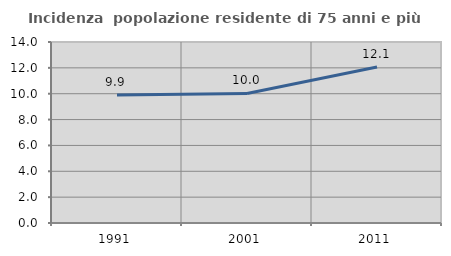
| Category | Incidenza  popolazione residente di 75 anni e più |
|---|---|
| 1991.0 | 9.906 |
| 2001.0 | 10.021 |
| 2011.0 | 12.059 |